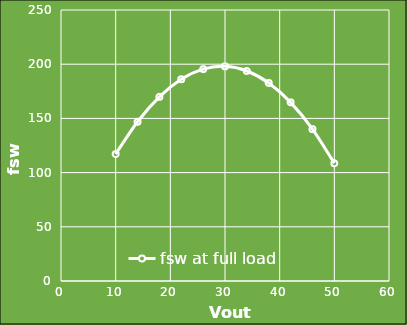
| Category | fsw at full load |
|---|---|
| 50.0 | 108.58 |
| 46.0 | 140.089 |
| 42.0 | 164.786 |
| 38.0 | 182.67 |
| 34.0 | 193.741 |
| 30.0 | 197.999 |
| 26.0 | 195.444 |
| 22.0 | 186.076 |
| 18.0 | 169.896 |
| 14.0 | 146.902 |
| 10.0 | 117.096 |